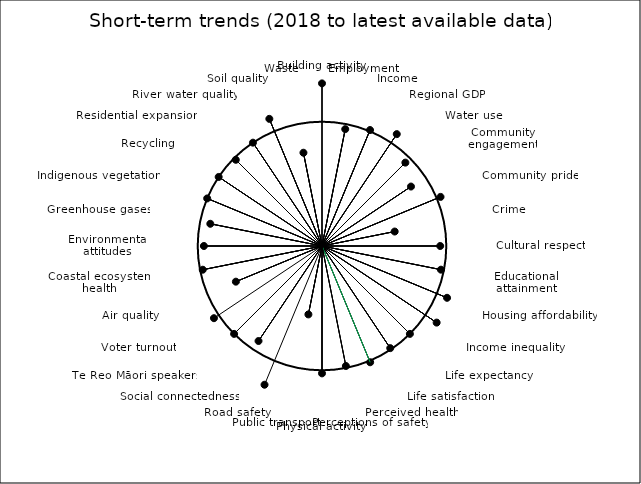
| Category | 2017 | latest |
|---|---|---|
| Building activity | 1 | 1.308 |
|  | 1 | 0 |
| Employment | 1 | 0.959 |
|  | 1 | 0 |
| Income | 1 | 1.01 |
|  | 1 | 0 |
| Regional GDP | 1 | 1.083 |
|  | 1 | 0 |
| Water use | 1 | 0.949 |
|  | 1 | 0 |
| Community engagement | 1 | 0.861 |
|  | 1 | 0 |
| Community pride | 1 | 1.032 |
|  | 1 | 0 |
| Crime | 1 | 0.596 |
|  | 1 | 0 |
| Cultural respect | 1 | 0.951 |
|  | 1 | 0 |
| Educational attainment | 1 | 0.976 |
|  | 1 | 0 |
| Housing affordability | 1 | 1.089 |
|  | 1 | 0 |
| Income inequality | 1 | 1.109 |
|  | 1 | 0 |
| Life expectancy | 1 | 1 |
|  | 1 | 0 |
| Life satisfaction | 1 | 0.989 |
|  | 1 | 0 |
| Perceived health | 1 | 1.013 |
|  | 1 | 0 |
| Perceptions of safety | 1 | 0.984 |
|  | 1 | 0 |
| Physical activity | 1 | 1.025 |
|  | 1 | 0 |
| Public transport | 1 | 0.561 |
|  | 1 | 0 |
| Road safety | 1 | 1.208 |
|  | 1 | 0 |
| Social connectedness | 1 | 0.919 |
|  | 1 | 0 |
| Te Reo Māori speakers | 1 | 1 |
|  | 1 | 0 |
| Voter turnout | 1 | 1.046 |
|  | 1 | 0 |
| Air quality | 1 | 0.75 |
|  | 1 | 0 |
| Coastal ecosystem health | 1 | 0.979 |
|  | 1 | 0 |
| Environmental attitudes | 1 | 0.95 |
|  | 1 | 0 |
| Greenhouse gases | 1 | 0.916 |
|  | 1 | 0 |
| Indigenous vegetation | 1 | 1 |
|  | 1 | 0 |
| Recycling | 1 | 1 |
|  | 1 | 0 |
| Residential expansion | 1 | 0.981 |
|  | 1 | 0 |
| River water quality | 1 | 1 |
|  | 1 | 0 |
| Soil quality | 1 | 1.107 |
|  | 1 | 0 |
| Waste | 1 | 0.765 |